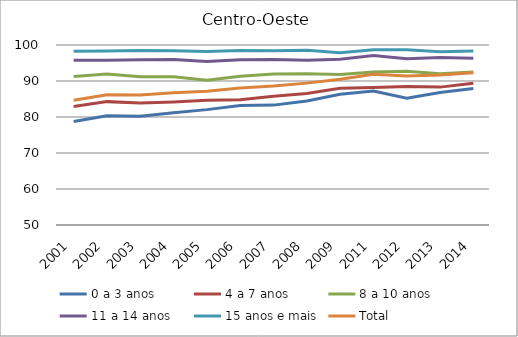
| Category | 0 a 3 anos | 4 a 7 anos | 8 a 10 anos | 11 a 14 anos | 15 anos e mais | Total |
|---|---|---|---|---|---|---|
| 2001.0 | 78.76 | 82.92 | 91.26 | 95.73 | 98.28 | 84.67 |
| 2002.0 | 80.37 | 84.27 | 91.96 | 95.76 | 98.31 | 86.18 |
| 2003.0 | 80.2 | 83.87 | 91.19 | 95.87 | 98.48 | 86.08 |
| 2004.0 | 81.18 | 84.18 | 91.21 | 95.98 | 98.42 | 86.75 |
| 2005.0 | 82.05 | 84.65 | 90.19 | 95.41 | 98.16 | 87.14 |
| 2006.0 | 83.18 | 84.79 | 91.34 | 95.88 | 98.49 | 88.05 |
| 2007.0 | 83.3 | 85.76 | 91.94 | 95.96 | 98.38 | 88.59 |
| 2008.0 | 84.47 | 86.51 | 92.02 | 95.79 | 98.56 | 89.41 |
| 2009.0 | 86.3 | 87.98 | 91.81 | 96.05 | 97.82 | 90.47 |
| 2011.0 | 87.2 | 88.2 | 92.5 | 97.1 | 98.7 | 91.9 |
| 2012.0 | 85.2 | 88.5 | 92.7 | 96.2 | 98.7 | 91.4 |
| 2013.0 | 86.8 | 88.3 | 92 | 96.5 | 98.1 | 91.7 |
| 2014.0 | 87.9 | 89.4 | 92.5 | 96.3 | 98.3 | 92.3 |